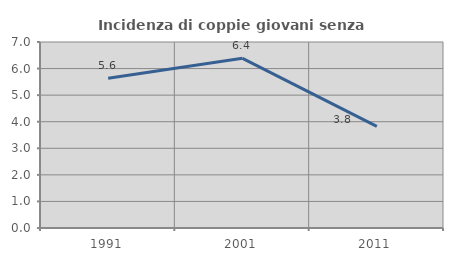
| Category | Incidenza di coppie giovani senza figli |
|---|---|
| 1991.0 | 5.639 |
| 2001.0 | 6.385 |
| 2011.0 | 3.822 |